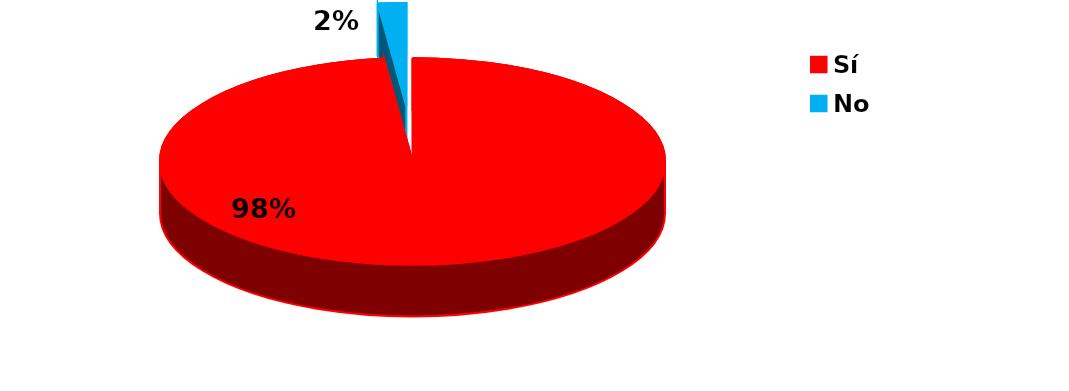
| Category | Series 0 |
|---|---|
| Sí | 109 |
| No | 2 |